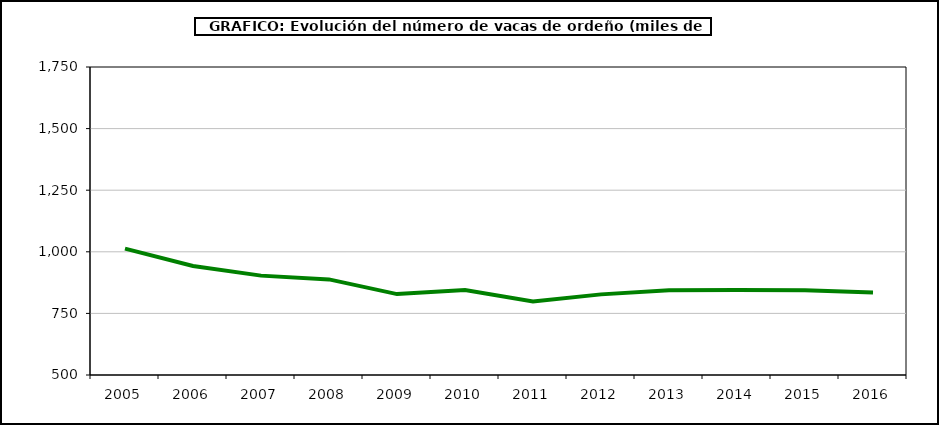
| Category | Leche de vaca |
|---|---|
| 2005.0 | 1012.914 |
| 2006.0 | 942.344 |
| 2007.0 | 903.287 |
| 2008.0 | 888 |
| 2009.0 | 828.347 |
| 2010.0 | 845 |
| 2011.0 | 798 |
| 2012.0 | 827.207 |
| 2013.0 | 844.06 |
| 2014.0 | 844.79 |
| 2015.0 | 844.114 |
| 2016.0 | 834.453 |